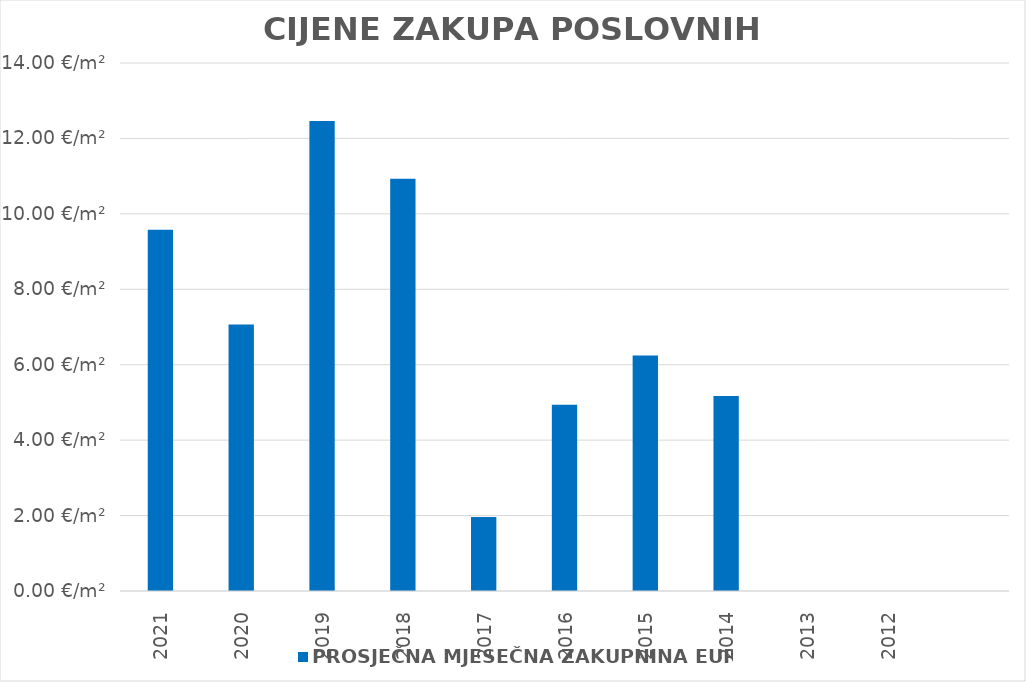
| Category | PROSJEČNA MJESEČNA ZAKUPNINA EUR/m2 |
|---|---|
| 2021 | 1900-01-09 13:52:35 |
| 2020 | 1900-01-07 01:33:22 |
| 2019 | 1900-01-12 11:01:14 |
| 2018 | 1900-01-10 22:21:56 |
| 2017 | 1900-01-01 23:01:13 |
| 2016 | 1900-01-04 22:28:12 |
| 2015 | 1900-01-06 05:56:19 |
| 2014 | 1900-01-05 04:01:12 |
| 2013 | 0 |
| 2012 | 0 |